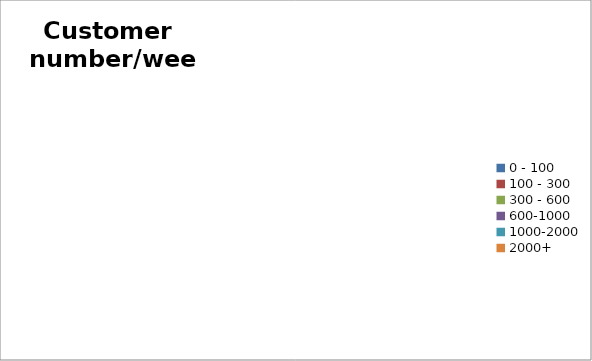
| Category | Series 0 |
|---|---|
| 0 - 100 | 0 |
| 100 - 300 | 0 |
| 300 - 600 | 0 |
| 600-1000 | 0 |
| 1000-2000 | 0 |
| 2000+ | 0 |